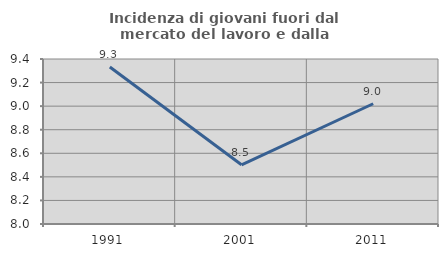
| Category | Incidenza di giovani fuori dal mercato del lavoro e dalla formazione  |
|---|---|
| 1991.0 | 9.332 |
| 2001.0 | 8.502 |
| 2011.0 | 9.02 |